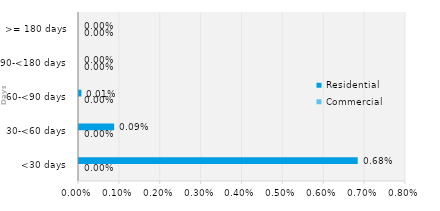
| Category | Commercial | Residential |
|---|---|---|
| <30 days | 0 | 0.007 |
| 30-<60 days | 0 | 0.001 |
| 60-<90 days | 0 | 0 |
| 90-<180 days | 0 | 0 |
| >= 180 days | 0 | 0 |